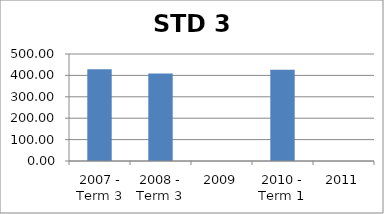
| Category | Score |
|---|---|
| 2007 - Term 3 | 428.46 |
| 2008 - Term 3 | 408.99 |
| 2009 | 0 |
| 2010 - Term 1 | 426.52 |
| 2011 | 0 |